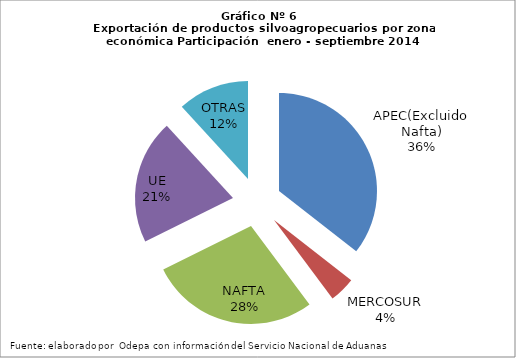
| Category | Series 0 |
|---|---|
| APEC(Excluido Nafta) | 4354263.662 |
| MERCOSUR | 522075.362 |
| NAFTA | 3409805.935 |
| UE | 2514872.528 |
| OTRAS | 1445629.514 |